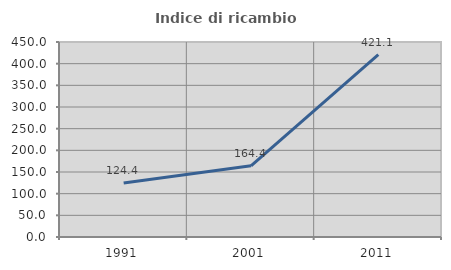
| Category | Indice di ricambio occupazionale  |
|---|---|
| 1991.0 | 124.409 |
| 2001.0 | 164.384 |
| 2011.0 | 421.053 |